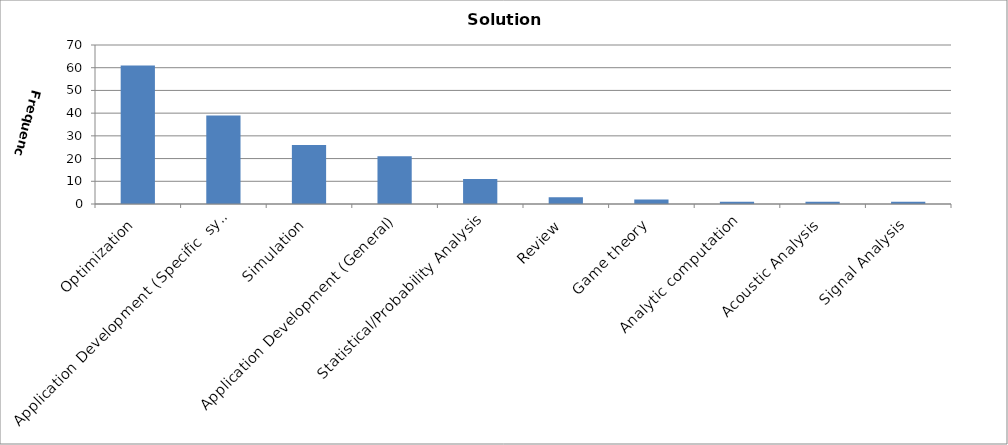
| Category | Methodology |
|---|---|
| Optimization | 61 |
| Application Development (Specific  systems) | 39 |
| Simulation | 26 |
| Application Development (General) | 21 |
| Statistical/Probability Analysis | 11 |
| Review | 3 |
| Game theory | 2 |
| Analytic computation | 1 |
| Acoustic Analysis | 1 |
| Signal Analysis | 1 |